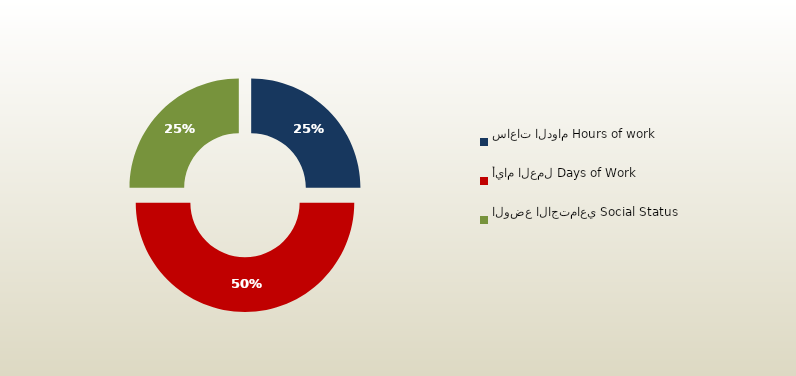
| Category | المجموع
Total |
|---|---|
| ساعات الدوام Hours of work | 63 |
| أيام العمل Days of Work | 126 |
| الوضع الاجتماعي Social Status | 63 |